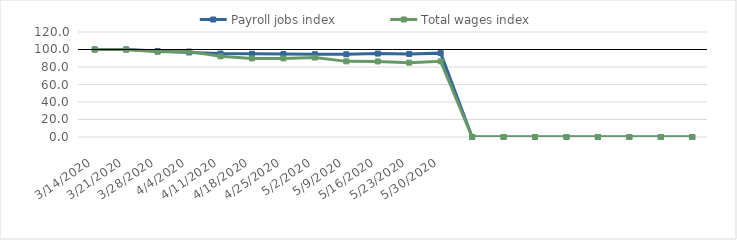
| Category | Payroll jobs index | Total wages index |
|---|---|---|
| 14/03/2020 | 100 | 100 |
| 21/03/2020 | 100.083 | 99.877 |
| 28/03/2020 | 98.331 | 97.411 |
| 04/04/2020 | 96.643 | 97.767 |
| 11/04/2020 | 95.387 | 92.155 |
| 18/04/2020 | 95.105 | 89.821 |
| 25/04/2020 | 94.786 | 89.824 |
| 02/05/2020 | 94.557 | 90.792 |
| 09/05/2020 | 94.515 | 86.433 |
| 16/05/2020 | 95.342 | 86.326 |
| 23/05/2020 | 94.92 | 84.97 |
| 30/05/2020 | 95.855 | 86.487 |